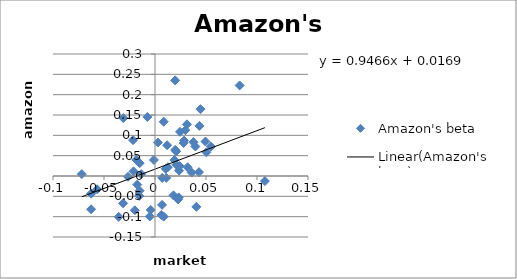
| Category | Amazon's beta |
|---|---|
| 0.011873817294504763 | 0.076 |
| 0.08298311776039413 | 0.223 |
| -0.026442831573227132 | -0.002 |
| -0.06258081816720285 | -0.043 |
| 0.019742029696721453 | 0.235 |
| -0.021011672375900514 | 0.011 |
| 0.010491382393316817 | 0.018 |
| 0.008520819730124751 | 0.134 |
| -0.01739610691375626 | -0.021 |
| 0.054892511014553946 | 0.072 |
| -0.031040805790470194 | 0.142 |
| -0.004188587877920424 | -0.084 |
| 0.02453358876036482 | 0.109 |
| 0.02320146078677232 | -0.053 |
| -0.015513837223063764 | -0.049 |
| 0.03765529548973512 | 0.083 |
| -0.015079830581919862 | -0.036 |
| 0.01905833165892057 | 0.039 |
| 0.021030280012996005 | 0.028 |
| 0.006200788965052828 | -0.096 |
| 0.006932165607935747 | -0.071 |
| 0.04311702997659528 | 0.01 |
| -0.035582905675162646 | -0.101 |
| 0.02356279155049279 | 0.013 |
| 0.02804947163518645 | 0.081 |
| 0.04459575261800608 | 0.164 |
| 0.029749523177239112 | 0.113 |
| -0.031298019033866864 | -0.067 |
| 0.04946207981522499 | 0.085 |
| -0.014999301636062778 | 0.032 |
| 0.020762811721046104 | 0.061 |
| 0.01808576785925231 | -0.048 |
| 0.035987723516956116 | 0.008 |
| 0.011060649195259176 | -0.005 |
| 0.05042809651957847 | 0.058 |
| 0.007068230463864511 | -0.005 |
| 0.002846717017343403 | 0.082 |
| -0.019789409878227415 | -0.084 |
| 0.024236153696477025 | 0.024 |
| 0.019763369680148246 | 0.064 |
| 0.012597574126154365 | 0.022 |
| 0.03955498213459152 | 0.073 |
| -0.06265072563317764 | -0.082 |
| -0.00749745270927038 | 0.145 |
| 0.03133231453053065 | 0.127 |
| 0.040589464130841746 | -0.076 |
| 0.043583062218506274 | 0.123 |
| 0.008532763948144062 | -0.1 |
| -0.005058715193587249 | -0.099 |
| 0.10772303853581011 | -0.013 |
| -0.07176198830376013 | 0.005 |
| -0.05679110746359761 | -0.033 |
| -0.021474425791952023 | 0.088 |
| -0.01825746126569705 | 0.04 |
| -0.01350095276693064 | 0.004 |
| 0.02849538044379507 | 0.087 |
| -0.0010473132038185673 | 0.039 |
| 0.03195656405295222 | 0.022 |
| 0.02264557398008682 | -0.058 |